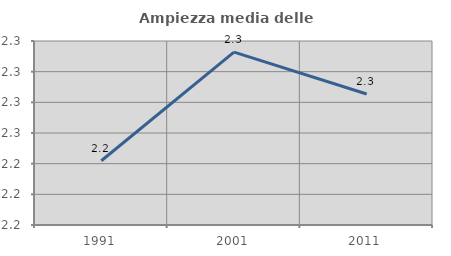
| Category | Ampiezza media delle famiglie |
|---|---|
| 1991.0 | 2.242 |
| 2001.0 | 2.313 |
| 2011.0 | 2.285 |